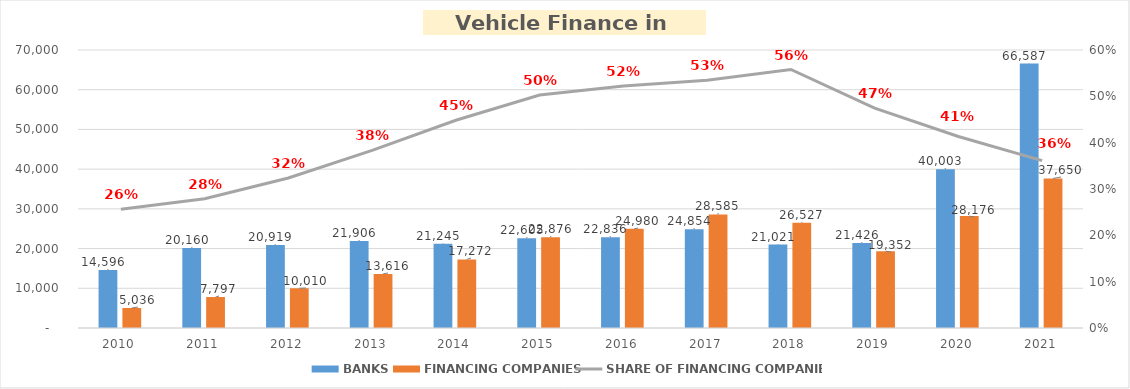
| Category | BANKS | FINANCING COMPANIES |
|---|---|---|
| 2010 | 14595.746 | 5035.89 |
| 2011 | 20160.143 | 7796.854 |
| 2012 | 20919.143 | 10009.755 |
| 2013 | 21905.99 | 13616.036 |
| 2014 | 21244.953 | 17271.844 |
| 2015 | 22605.033 | 22875.563 |
| 2016 | 22835.961 | 24980.231 |
| 2017 | 24853.571 | 28584.938 |
| 2018 | 21021.01 | 26527.133 |
| 2019 | 21426.278 | 19352.327 |
| 2020 | 40002.964 | 28176.3 |
| 2021 | 66586.576 | 37649.688 |